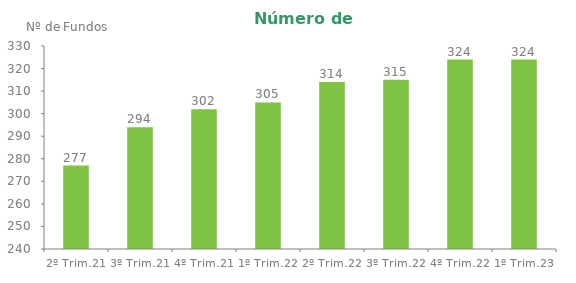
| Category | Series 0 |
|---|---|
| 2º Trim.21 | 277 |
| 3º Trim.21 | 294 |
| 4º Trim.21 | 302 |
| 1º Trim.22 | 305 |
| 2º Trim.22 | 314 |
| 3º Trim.22 | 315 |
| 4º Trim.22 | 324 |
| 1º Trim.23 | 324 |